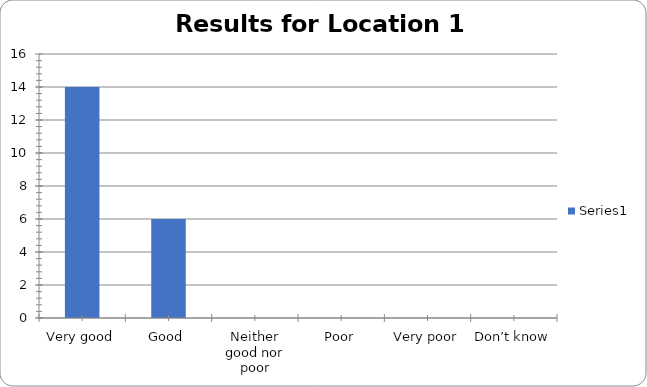
| Category | Series 0 |
|---|---|
| Very good | 14 |
| Good | 6 |
| Neither good nor poor | 0 |
| Poor | 0 |
| Very poor | 0 |
| Don’t know | 0 |